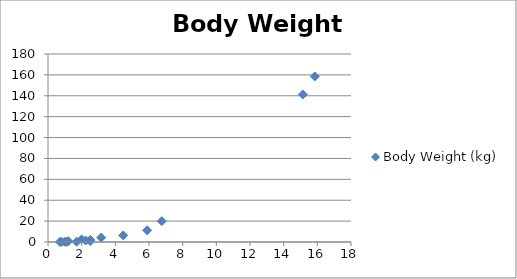
| Category | Body Weight (kg) |
|---|---|
| 0.7943 | 0.083 |
| 0.7079 | 0.091 |
| 1.0 | 0.141 |
| 1.122 | 0.246 |
| 1.6982 | 0.282 |
| 1.2023 | 0.794 |
| 1.9953 | 2.512 |
| 2.2387 | 1.412 |
| 2.5119 | 0.891 |
| 2.5119 | 1.995 |
| 3.1623 | 4.266 |
| 4.4668 | 6.31 |
| 5.8884 | 11.22 |
| 6.7608 | 19.95 |
| 15.136 | 141.25 |
| 15.85 | 158.489 |